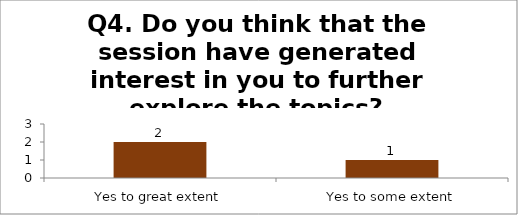
| Category | Q4. Do you think that the session have generated interest in you to further explore the topics? |
|---|---|
| Yes to great extent | 2 |
| Yes to some extent | 1 |